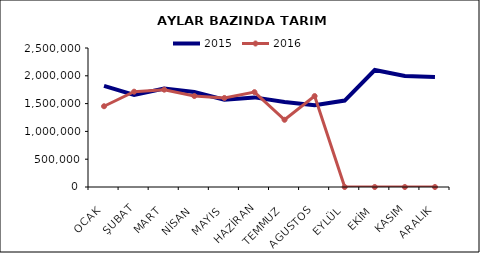
| Category | 2015 | 2016 |
|---|---|---|
| OCAK | 1817721.749 | 1452466.259 |
| ŞUBAT | 1656336.702 | 1714345.249 |
| MART | 1770947.389 | 1750288.15 |
| NİSAN | 1707978.739 | 1636550.281 |
| MAYIS | 1569239.73 | 1601408.732 |
| HAZİRAN | 1611622.689 | 1705910.726 |
| TEMMUZ | 1530250.58 | 1209099.117 |
| AGUSTOS | 1469644.862 | 1634866.041 |
| EYLÜL | 1554599.89 | 0 |
| EKİM | 2104560 | 0 |
| KASIM | 1997191.927 | 0 |
| ARALIK | 1980389.634 | 0 |